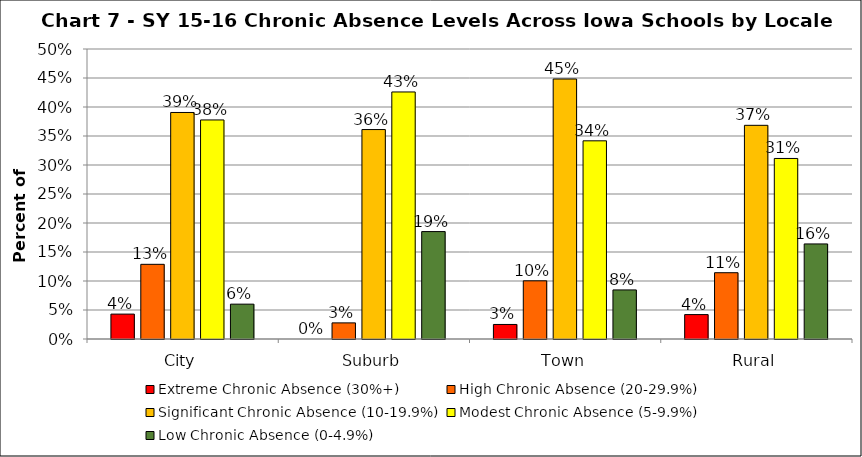
| Category | Extreme Chronic Absence (30%+) | High Chronic Absence (20-29.9%) | Significant Chronic Absence (10-19.9%) | Modest Chronic Absence (5-9.9%) | Low Chronic Absence (0-4.9%) |
|---|---|---|---|---|---|
| 0 | 0.043 | 0.129 | 0.391 | 0.378 | 0.06 |
| 1 | 0 | 0.028 | 0.361 | 0.426 | 0.185 |
| 2 | 0.025 | 0.1 | 0.448 | 0.342 | 0.085 |
| 3 | 0.042 | 0.114 | 0.368 | 0.311 | 0.164 |